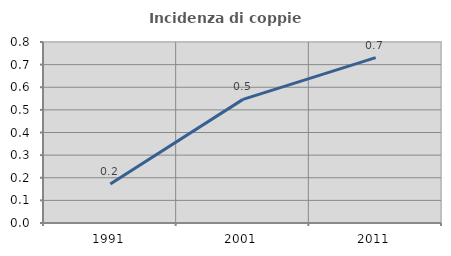
| Category | Incidenza di coppie miste |
|---|---|
| 1991.0 | 0.172 |
| 2001.0 | 0.546 |
| 2011.0 | 0.731 |